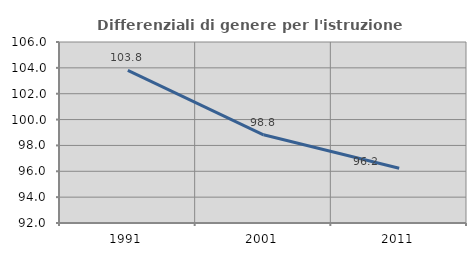
| Category | Differenziali di genere per l'istruzione superiore |
|---|---|
| 1991.0 | 103.804 |
| 2001.0 | 98.82 |
| 2011.0 | 96.24 |